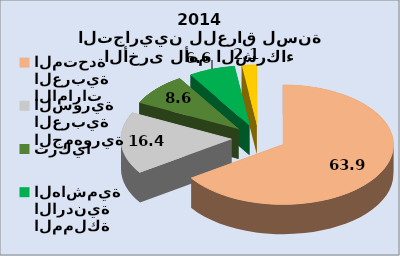
| Category | الصادرات السلعية الأخرى لأهم الشركاء التجاريين للعراق لسنة 2014 |
|---|---|
| الامارات العربية المتحدة | 63.93 |
| الجمهورية العربية السورية | 16.352 |
| تركيا | 8.571 |
| المملكة الاردنية الهاشمية | 6.582 |
| لبنان | 2.129 |